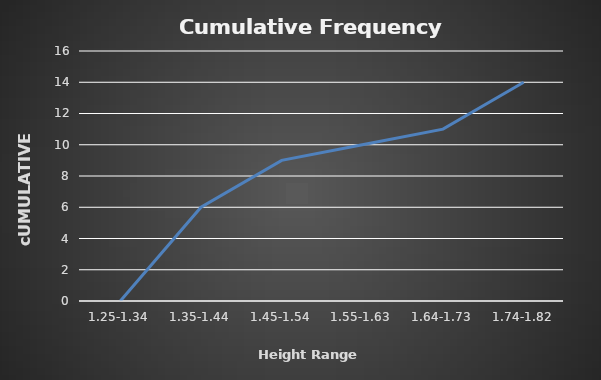
| Category | Cumulative Frequency |
|---|---|
| 1.25-1.34 | 0 |
| 1.35-1.44 | 6 |
| 1.45-1.54 | 9 |
| 1.55-1.63 | 10 |
| 1.64-1.73 | 11 |
| 1.74-1.82 | 14 |